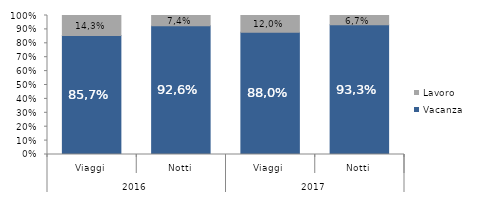
| Category | Vacanza | Lavoro |
|---|---|---|
| 0 | 85.7 | 14.3 |
| 1 | 92.6 | 7.4 |
| 2 | 88 | 12 |
| 3 | 93.3 | 6.7 |